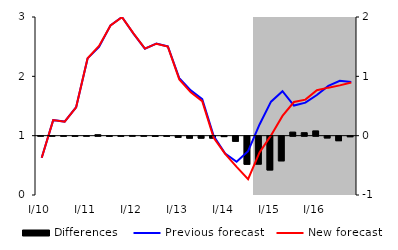
| Category | Differences |
|---|---|
| 0 | 0.001 |
| 1 | 0 |
| 2 | -0.001 |
| 3 | -0.001 |
| 4 | 0.002 |
| 5 | 0.017 |
| 6 | -0.002 |
| 7 | -0.002 |
| 8 | 0.003 |
| 9 | 0.001 |
| 10 | -0.004 |
| 11 | -0.002 |
| 12 | -0.019 |
| 13 | -0.033 |
| 14 | -0.033 |
| 15 | -0.033 |
| 16 | -0.007 |
| 17 | -0.086 |
| 18 | -0.473 |
| 19 | -0.471 |
| 20 | -0.569 |
| 21 | -0.416 |
| 22 | 0.06 |
| 23 | 0.051 |
| 24 | 0.081 |
| 25 | -0.03 |
| 26 | -0.076 |
| 27 | -0.009 |